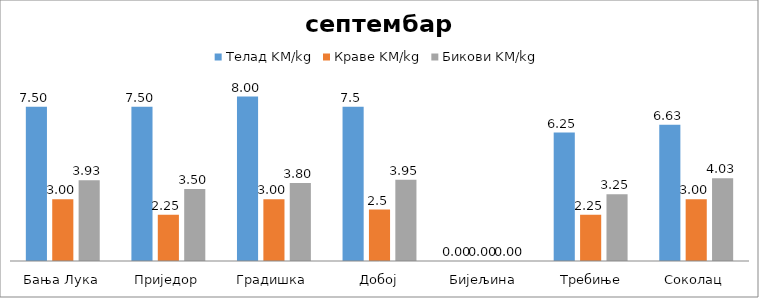
| Category | Телад KM/kg | Краве KM/kg | Бикови KM/kg |
|---|---|---|---|
| Бања Лука | 7.5 | 3 | 3.925 |
| Приједор | 7.5 | 2.25 | 3.5 |
| Градишка | 8 | 3 | 3.8 |
| Добој | 7.5 | 2.5 | 3.95 |
| Бијељина | 0 | 0 | 0 |
|  Требиње | 6.25 | 2.25 | 3.25 |
| Соколац | 6.625 | 3 | 4.025 |